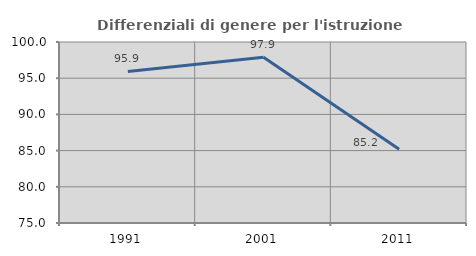
| Category | Differenziali di genere per l'istruzione superiore |
|---|---|
| 1991.0 | 95.933 |
| 2001.0 | 97.906 |
| 2011.0 | 85.185 |